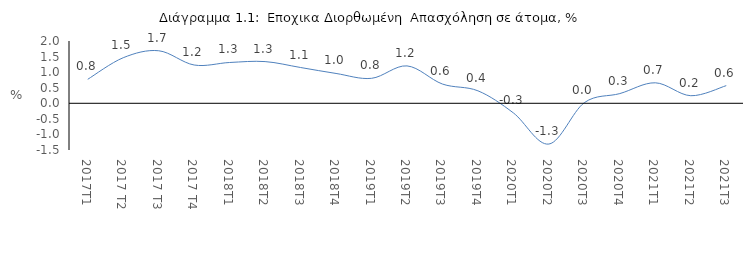
| Category | Series 0 |
|---|---|
| 2017Τ1 | 0.77 |
| 2017 Τ2 | 1.463 |
| 2017 Τ3 | 1.687 |
| 2017 Τ4 | 1.229 |
| 2018Τ1 | 1.31 |
| 2018Τ2 | 1.339 |
| 2018Τ3 | 1.149 |
| 2018Τ4 | 0.958 |
| 2019Τ1 | 0.801 |
| 2019Τ2 | 1.2 |
| 2019Τ3 | 0.618 |
| 2019Τ4 | 0.4 |
| 2020Τ1 | -0.31 |
| 2020Τ2 | -1.309 |
| 2020Τ3 | 0.021 |
| 2020Τ4 | 0.312 |
| 2021T1 | 0.658 |
| 2021T2 | 0.243 |
| 2021T3 | 0.567 |